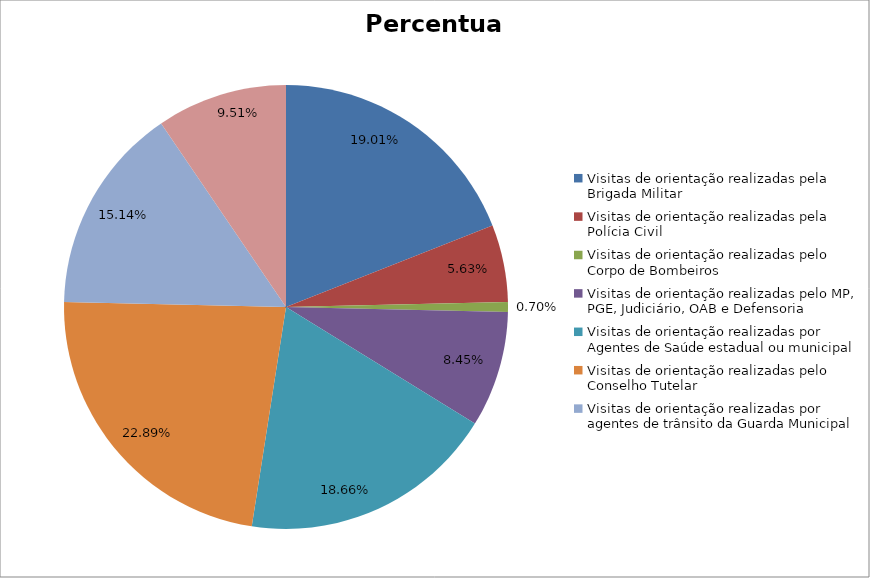
| Category | Percentual |
|---|---|
| Visitas de orientação realizadas pela Brigada Militar | 0.19 |
| Visitas de orientação realizadas pela Polícia Civil | 0.056 |
| Visitas de orientação realizadas pelo Corpo de Bombeiros | 0.007 |
| Visitas de orientação realizadas pelo MP, PGE, Judiciário, OAB e Defensoria | 0.085 |
| Visitas de orientação realizadas por Agentes de Saúde estadual ou municipal | 0.187 |
| Visitas de orientação realizadas pelo Conselho Tutelar | 0.229 |
| Visitas de orientação realizadas por agentes de trânsito da Guarda Municipal | 0.151 |
| Visitas de orientação realizadas por ONGs, entidades privadas, CRAS e CREAS | 0.095 |